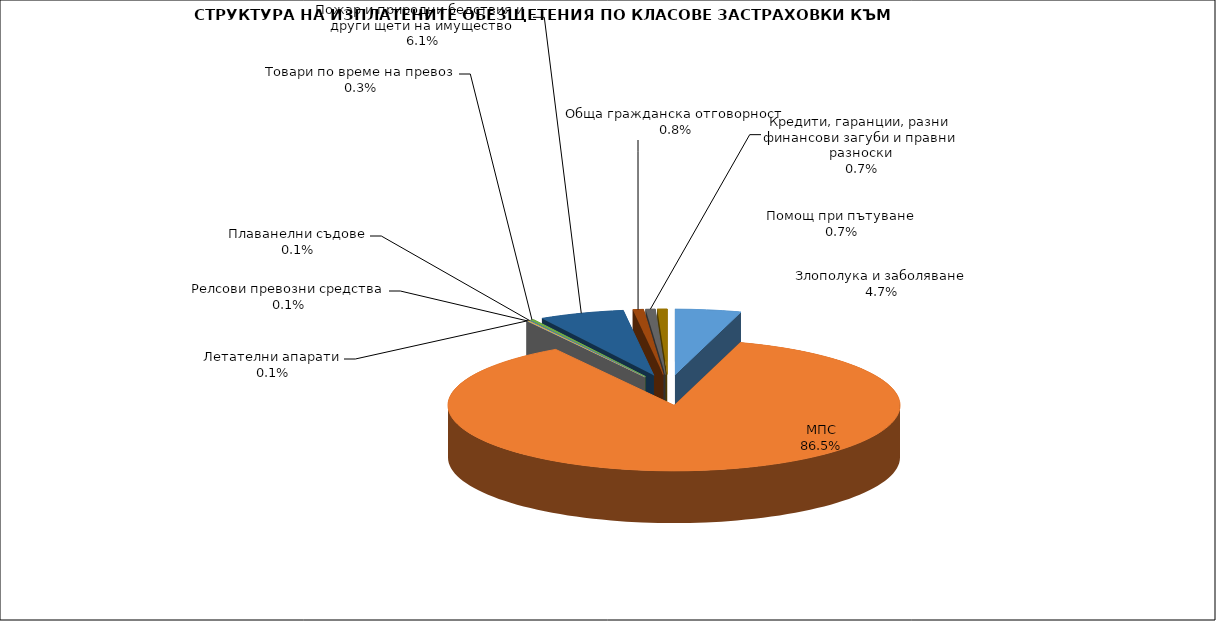
| Category | Series 0 |
|---|---|
| Злополука и заболяване | 0.047 |
| МПС | 0.865 |
| Релсови превозни средства | 0.001 |
| Летателни апарати | 0.001 |
| Плаванелни съдове | 0.001 |
| Товари по време на превоз | 0.003 |
| Пожар и природни бедствия и други щети на имущество | 0.061 |
| Обща гражданска отговорност | 0.008 |
| Кредити, гаранции, разни финансови загуби и правни разноски | 0.007 |
| Помощ при пътуване | 0.007 |